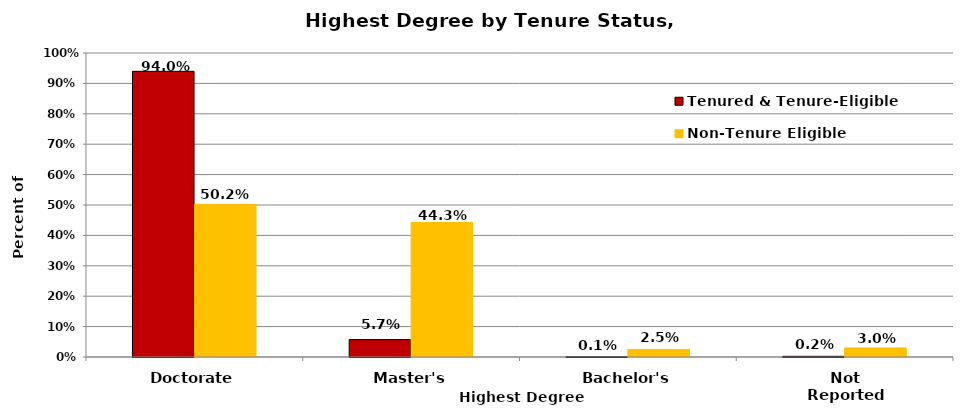
| Category | Tenured & Tenure-Eligible | Non-Tenure Eligible |
|---|---|---|
| Doctorate | 0.94 | 0.502 |
| Master's | 0.057 | 0.443 |
| Bachelor's | 0.001 | 0.025 |
| Not Reported | 0.002 | 0.03 |